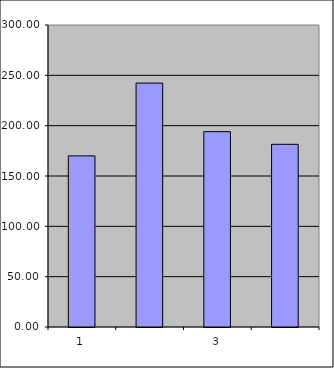
| Category | Series 0 |
|---|---|
| 0 | 170 |
| 1 | 242.311 |
| 2 | 194.057 |
| 3 | 181.478 |